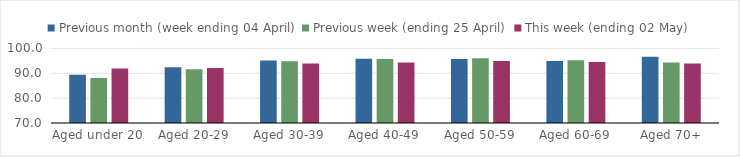
| Category | Previous month (week ending 04 April) | Previous week (ending 25 April) | This week (ending 02 May) |
|---|---|---|---|
| Aged under 20 | 89.41 | 88.095 | 91.944 |
| Aged 20-29 | 92.474 | 91.624 | 92.143 |
| Aged 30-39 | 95.099 | 94.848 | 93.944 |
| Aged 40-49 | 95.828 | 95.734 | 94.329 |
| Aged 50-59 | 95.767 | 96.05 | 94.901 |
| Aged 60-69 | 94.987 | 95.196 | 94.59 |
| Aged 70+ | 96.648 | 94.336 | 93.969 |